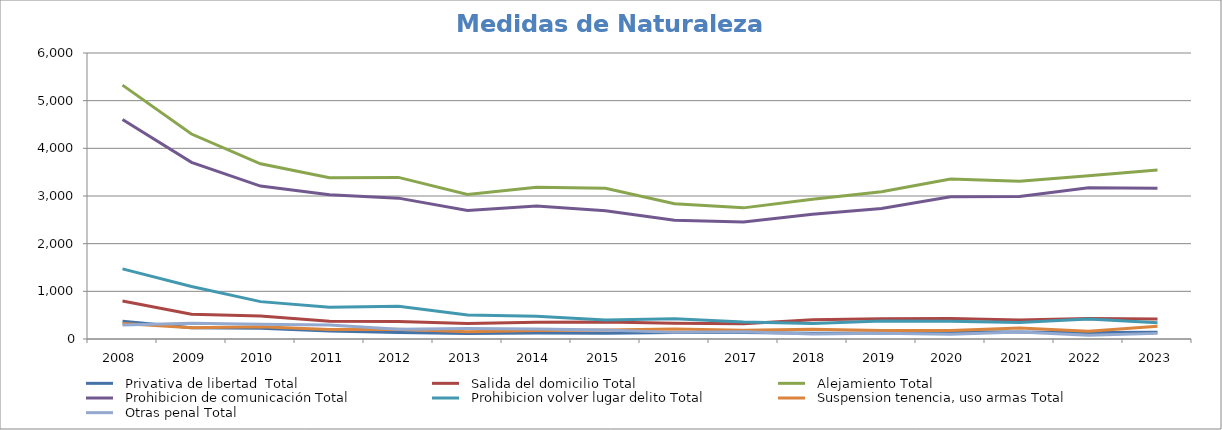
| Category |   Privativa de libertad  Total |   Salida del domicilio Total |   Alejamiento Total |   Prohibicion de comunicación Total |   Prohibicion volver lugar delito Total |   Suspension tenencia, uso armas Total |   Otras penal Total |
|---|---|---|---|---|---|---|---|
| 2008.0 | 372 | 799 | 5326 | 4603 | 1472 | 327 | 294 |
| 2009.0 | 234 | 521 | 4300 | 3706 | 1101 | 235 | 330 |
| 2010.0 | 226 | 483 | 3675 | 3208 | 784 | 256 | 311 |
| 2011.0 | 169 | 373 | 3383 | 3027 | 664 | 200 | 295 |
| 2012.0 | 137 | 369 | 3390 | 2955 | 686 | 204 | 203 |
| 2013.0 | 118 | 323 | 3030 | 2698 | 504 | 154 | 220 |
| 2014.0 | 126 | 350 | 3182 | 2790 | 479 | 176 | 212 |
| 2015.0 | 123 | 358 | 3163 | 2692 | 401 | 190 | 191 |
| 2016.0 | 138 | 329 | 2839 | 2490 | 423 | 209 | 139 |
| 2017.0 | 137 | 322 | 2751 | 2457 | 355 | 184 | 153 |
| 2018.0 | 120 | 405 | 2934 | 2618 | 323 | 206 | 105 |
| 2019.0 | 127 | 424 | 3088 | 2740 | 379 | 178 | 120 |
| 2020.0 | 151 | 432 | 3356 | 2982 | 372 | 179 | 102 |
| 2021.0 | 145 | 399 | 3307 | 2988 | 347 | 232 | 147 |
| 2022.0 | 135 | 432 | 3424 | 3175 | 419 | 165 | 80 |
| 2023.0 | 142 | 422 | 3544 | 3164 | 341 | 265 | 118 |